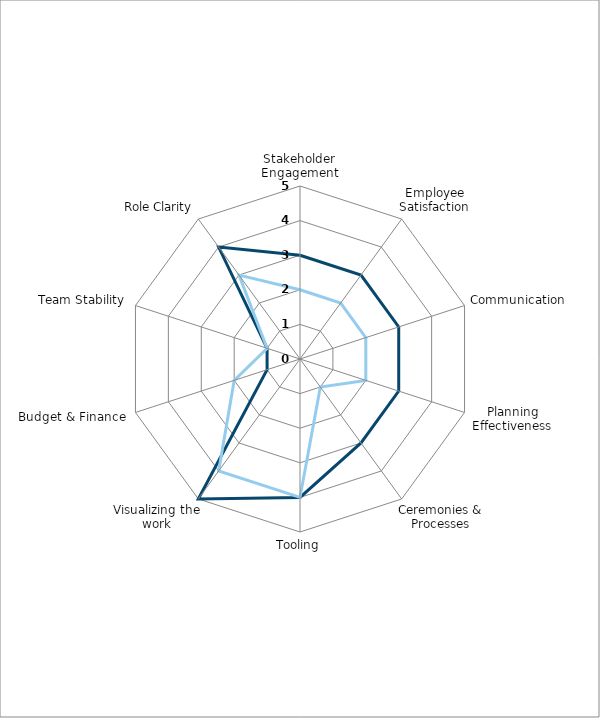
| Category | Series 0 | Series 1 |
|---|---|---|
| Stakeholder Engagement | 3 | 2 |
| Employee Satisfaction | 3 | 2 |
| Communication | 3 | 2 |
| Planning Effectiveness | 3 | 2 |
| Ceremonies & Processes | 3 | 1 |
| Tooling | 4 | 4 |
| Visualizing the work | 5 | 4 |
| Budget & Finance | 1 | 2 |
| Team Stability | 1 | 1 |
| Role Clarity  | 4 | 3 |